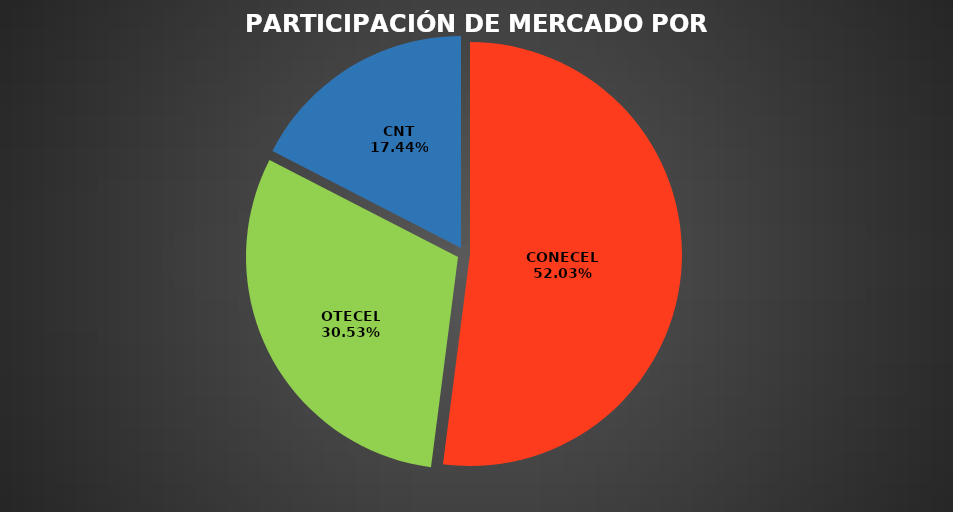
| Category | Abr 2023 |
|---|---|
| CONECEL | 9220042 |
| OTECEL | 5409581 |
| CNT | 3089410 |